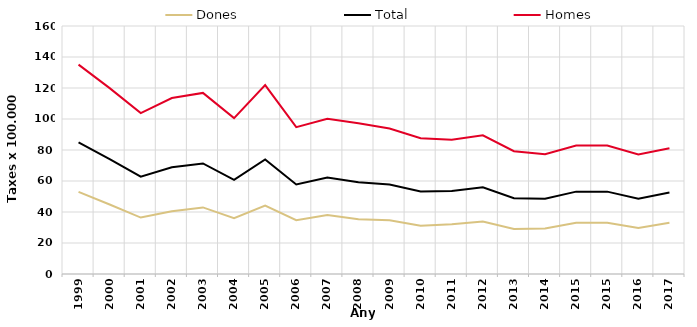
| Category | Dones | Total | Homes |
|---|---|---|---|
| 1999.0 | 53.01 | 84.99 | 135.08 |
| 2000.0 | 44.84 | 74.05 | 119.9 |
| 2001.0 | 36.41 | 62.79 | 103.83 |
| 2002.0 | 40.55 | 68.81 | 113.52 |
| 2003.0 | 42.95 | 71.32 | 116.84 |
| 2004.0 | 36.04 | 60.75 | 100.56 |
| 2005.0 | 44.17 | 73.95 | 121.85 |
| 2006.0 | 34.67 | 57.79 | 94.73 |
| 2007.0 | 38.08 | 62.31 | 100.1 |
| 2008.0 | 35.26 | 59.23 | 97.25 |
| 2009.0 | 34.71 | 57.7 | 93.84 |
| 2010.0 | 31.17 | 53.28 | 87.6 |
| 2011.0 | 32.15 | 53.52 | 86.65 |
| 2012.0 | 33.87 | 55.94 | 89.52 |
| 2013.0 | 29.03 | 48.9 | 79.23 |
| 2014.0 | 29.3 | 48.53 | 77.25 |
| 2015.0 | 33.08 | 53.13 | 82.91 |
| 2015.0 | 33.08 | 53.13 | 82.91 |
| 2016.0 | 29.72 | 48.62 | 77.12 |
| 2017.0 | 33.01 | 52.52 | 81.16 |